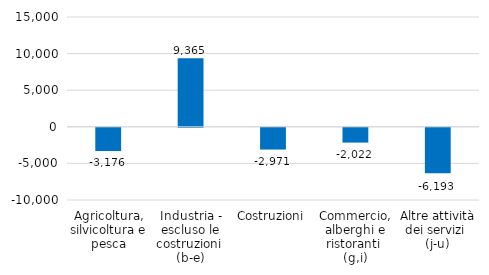
| Category | Series 0 |
|---|---|
| Agricoltura, silvicoltura e pesca | -3176 |
| Industria - escluso le costruzioni 
(b-e) | 9365 |
| Costruzioni | -2971 |
| Commercio, alberghi e ristoranti 
(g,i) | -2022 |
| Altre attività dei servizi 
(j-u) | -6193 |